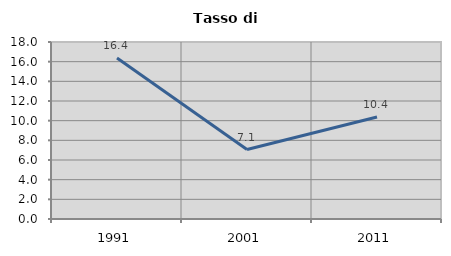
| Category | Tasso di disoccupazione   |
|---|---|
| 1991.0 | 16.375 |
| 2001.0 | 7.063 |
| 2011.0 | 10.366 |